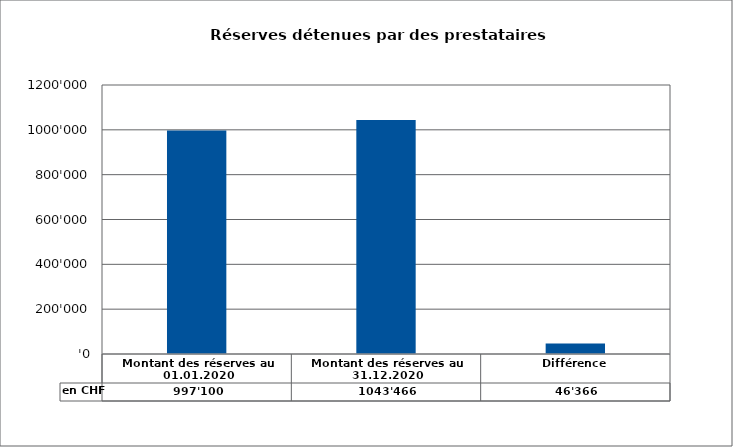
| Category | en CHF |
|---|---|
| Montant des réserves au 01.01.2020 | 997100.3 |
| Montant des réserves au 31.12.2020 | 1043466.3 |
| Différence | 46366 |